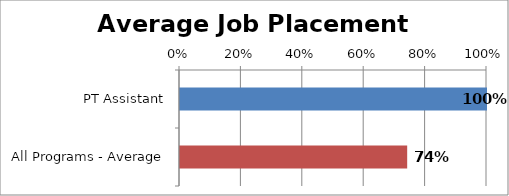
| Category | Series 0 |
|---|---|
| PT Assistant | 1 |
| All Programs - Average | 0.74 |